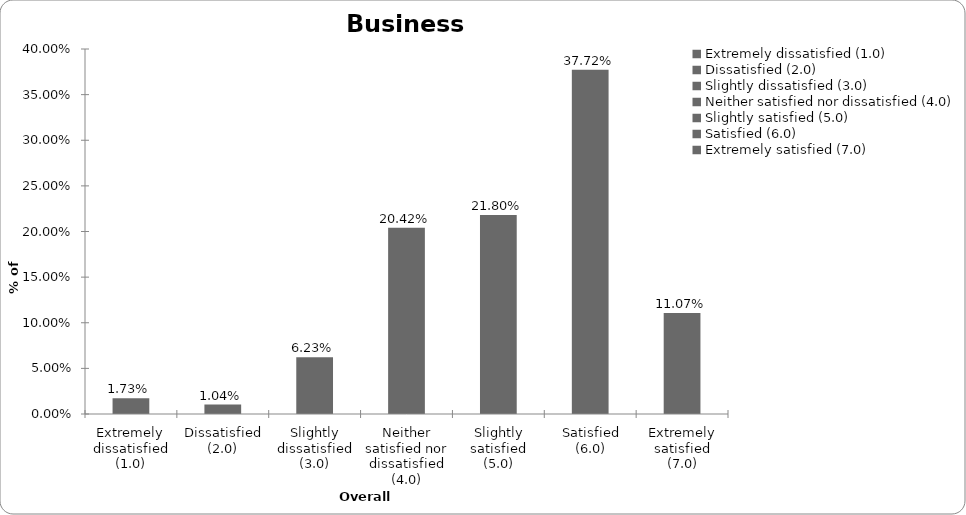
| Category | Series 0 |
|---|---|
| Extremely dissatisfied (1.0) | 0.017 |
| Dissatisfied (2.0) | 0.01 |
| Slightly dissatisfied (3.0) | 0.062 |
| Neither satisfied nor dissatisfied (4.0) | 0.204 |
| Slightly satisfied (5.0) | 0.218 |
| Satisfied (6.0) | 0.377 |
| Extremely satisfied (7.0) | 0.111 |